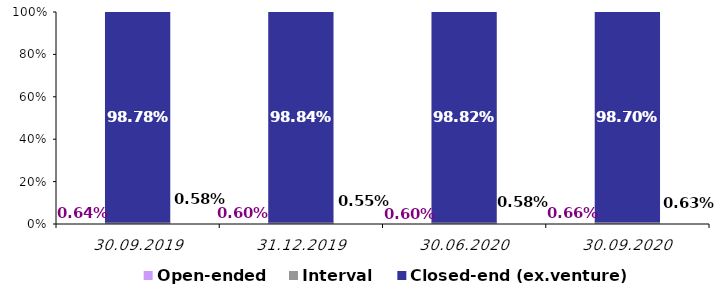
| Category | Open-ended | Interval | Closed-end (ex.venture) |
|---|---|---|---|
| 30.09.2019 | 0.006 | 0.006 | 0.988 |
| 31.12.2019 | 0.006 | 0.006 | 0.988 |
| 30.06.2020 | 0.006 | 0.006 | 0.988 |
| 30.09.2020 | 0.007 | 0.006 | 0.987 |